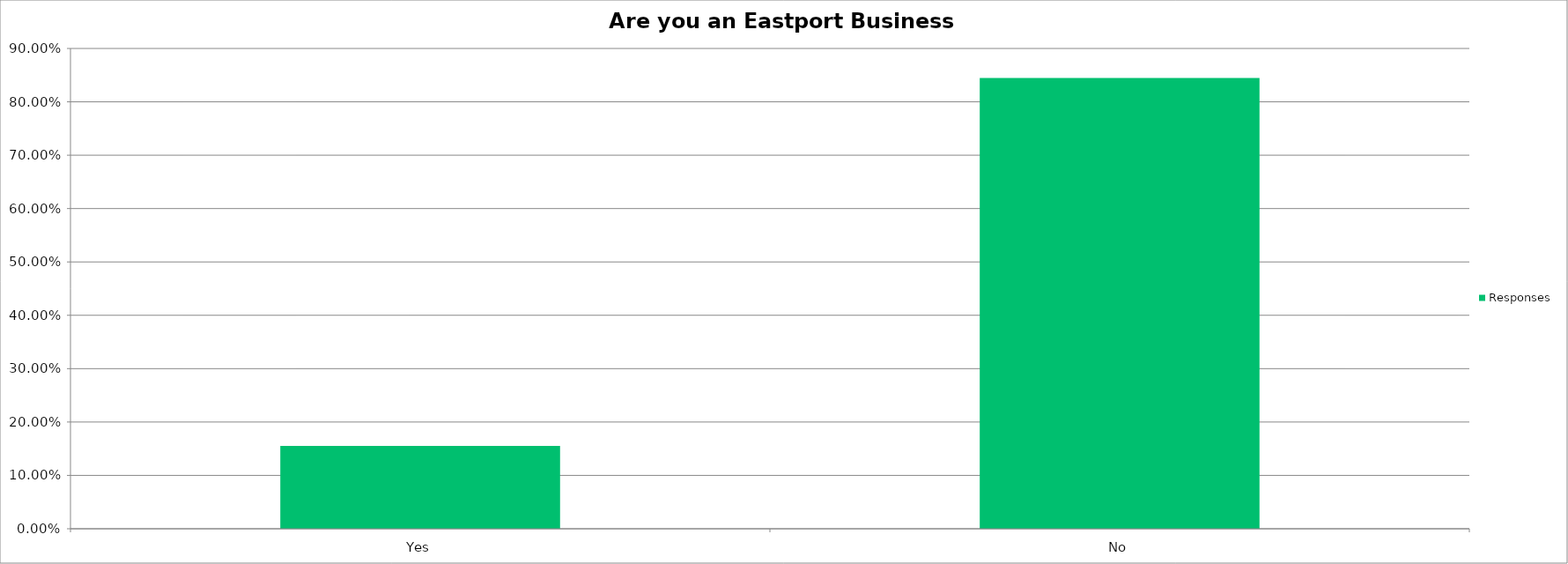
| Category | Responses |
|---|---|
| Yes | 0.155 |
| No | 0.845 |